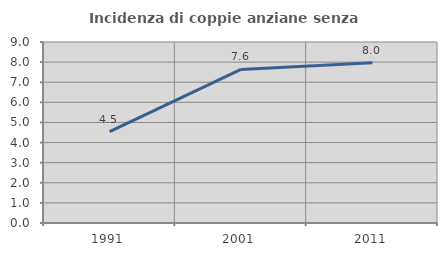
| Category | Incidenza di coppie anziane senza figli  |
|---|---|
| 1991.0 | 4.545 |
| 2001.0 | 7.634 |
| 2011.0 | 7.965 |